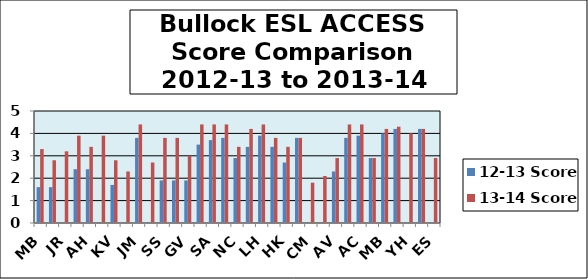
| Category | 12-13 Score | 13-14 Score |
|---|---|---|
| MB | 1.6 | 3.3 |
| JM | 1.6 | 2.8 |
| JR | 0 | 3.2 |
| TS | 2.4 | 3.9 |
| AH | 2.4 | 3.4 |
| CM | 0 | 3.9 |
| KV | 1.7 | 2.8 |
| DK | 0 | 2.3 |
| JM | 3.8 | 4.4 |
| CM | 0 | 2.7 |
| SS | 1.9 | 3.8 |
| AM | 1.9 | 3.8 |
| GV | 1.9 | 3 |
| JY | 3.5 | 4.4 |
| SA | 3.7 | 4.4 |
| AB | 3.8 | 4.4 |
| NC | 2.9 | 3.4 |
| JH | 3.4 | 4.2 |
| LH | 3.9 | 4.4 |
| NK | 3.4 | 3.8 |
| HK | 2.7 | 3.4 |
| GL | 3.8 | 3.8 |
| CM | 0 | 1.8 |
| JM | 0 | 2.1 |
| AV | 2.3 | 2.9 |
| AO | 3.8 | 4.4 |
| AC | 3.9 | 4.4 |
| AV | 2.9 | 2.9 |
| MB | 4 | 4.2 |
| NC | 4.2 | 4.3 |
| YH | 0 | 4 |
| HL | 4.2 | 4.2 |
| ES | 0 | 2.9 |